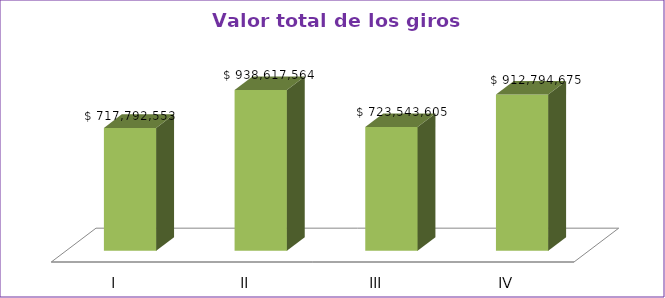
| Category | Series 0 |
|---|---|
| I | 717792553 |
| II | 938617564 |
| III | 723543605 |
| IV | 912794675 |